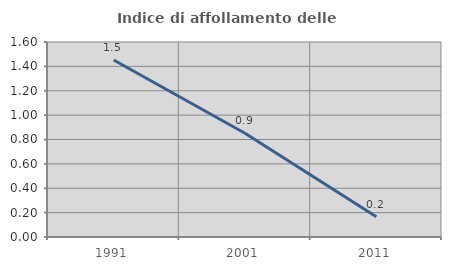
| Category | Indice di affollamento delle abitazioni  |
|---|---|
| 1991.0 | 1.452 |
| 2001.0 | 0.852 |
| 2011.0 | 0.166 |